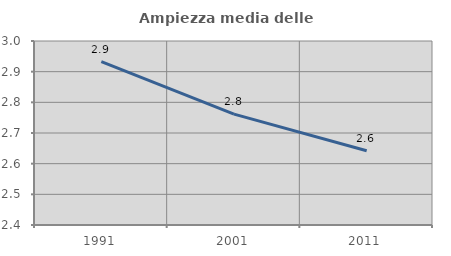
| Category | Ampiezza media delle famiglie |
|---|---|
| 1991.0 | 2.933 |
| 2001.0 | 2.762 |
| 2011.0 | 2.642 |